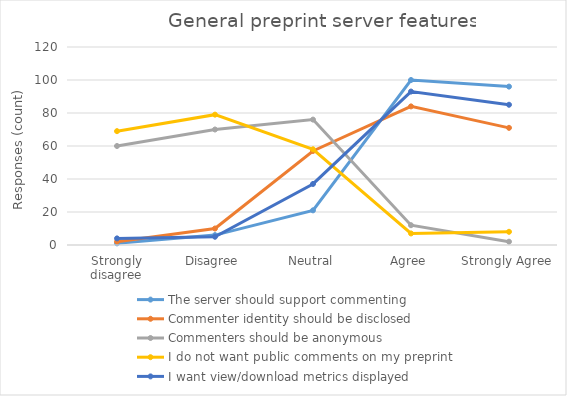
| Category | The server should support commenting | Commenter identity should be disclosed | Commenters should be anonymous | I do not want public comments on my preprint | I want view/download metrics displayed |
|---|---|---|---|---|---|
| Strongly disagree | 1 | 2 | 60 | 69 | 4 |
| Disagree | 6 | 10 | 70 | 79 | 5 |
| Neutral | 21 | 57 | 76 | 58 | 37 |
| Agree | 100 | 84 | 12 | 7 | 93 |
| Strongly Agree | 96 | 71 | 2 | 8 | 85 |